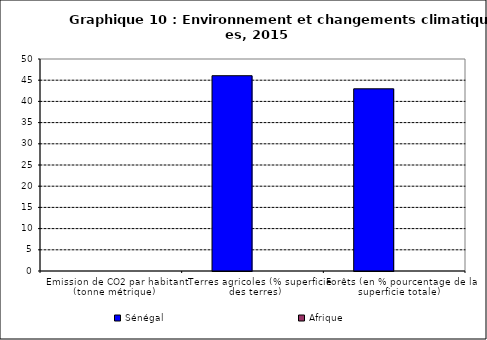
| Category | Sénégal | Afrique |
|---|---|---|
| Emission de CO2 par habitant (tonne métrique) | 0 | 0 |
| Terres agricoles (% superficie des terres) | 46.06 | 0 |
| Forêts (en % pourcentage de la superficie totale) | 42.97 | 0 |